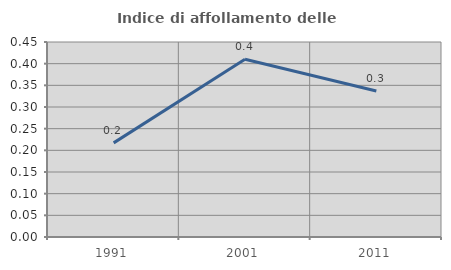
| Category | Indice di affollamento delle abitazioni  |
|---|---|
| 1991.0 | 0.217 |
| 2001.0 | 0.41 |
| 2011.0 | 0.337 |